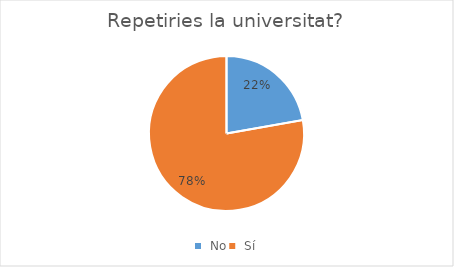
| Category | Series 0 |
|---|---|
|  No | 2 |
|  Sí | 7 |